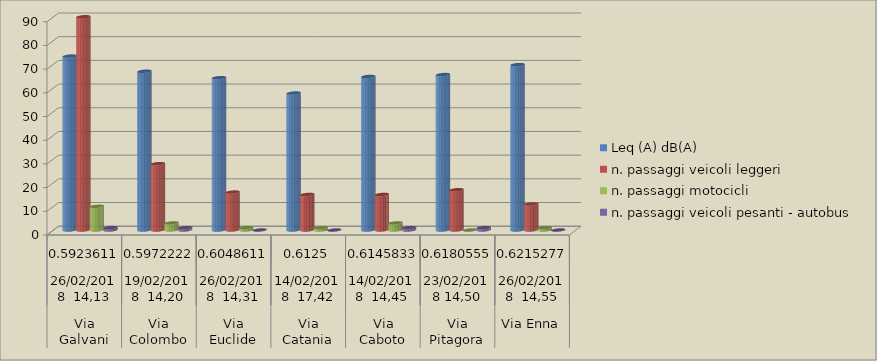
| Category | Leq (A) dB(A) | n. passaggi veicoli leggeri  | n. passaggi motocicli | n. passaggi veicoli pesanti - autobus  |
|---|---|---|---|---|
| 0 | 73.4 | 90 | 10 | 1 |
| 1 | 67 | 28 | 3 | 1 |
| 2 | 64.3 | 16 | 1 | 0 |
| 3 | 57.8 | 15 | 1 | 0 |
| 4 | 64.8 | 15 | 3 | 1 |
| 5 | 65.6 | 17 | 0 | 1 |
| 6 | 69.8 | 11 | 1 | 0 |